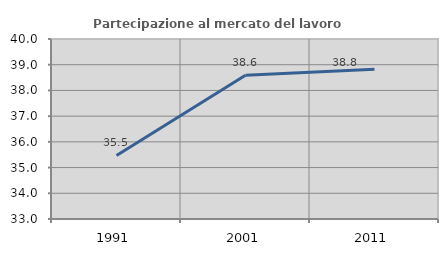
| Category | Partecipazione al mercato del lavoro  femminile |
|---|---|
| 1991.0 | 35.472 |
| 2001.0 | 38.593 |
| 2011.0 | 38.824 |